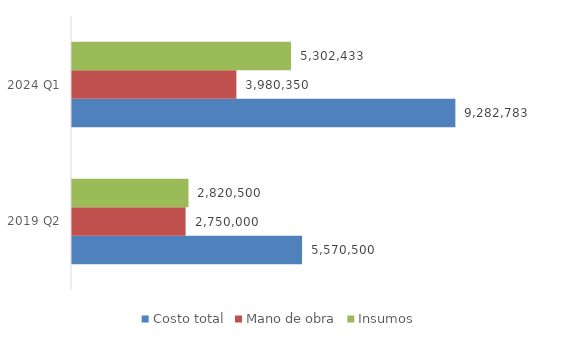
| Category | Costo total | Mano de obra | Insumos |
|---|---|---|---|
| 2019 Q2 | 5570500 | 2750000 | 2820500 |
| 2024 Q1 | 9282782.536 | 3980350 | 5302432.536 |